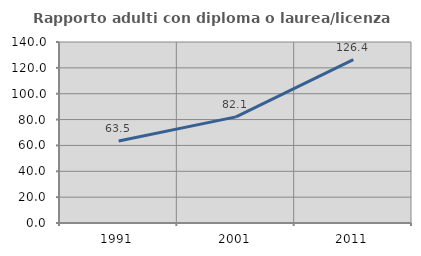
| Category | Rapporto adulti con diploma o laurea/licenza media  |
|---|---|
| 1991.0 | 63.494 |
| 2001.0 | 82.085 |
| 2011.0 | 126.363 |